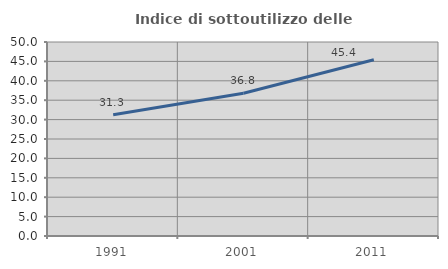
| Category | Indice di sottoutilizzo delle abitazioni  |
|---|---|
| 1991.0 | 31.267 |
| 2001.0 | 36.784 |
| 2011.0 | 45.409 |